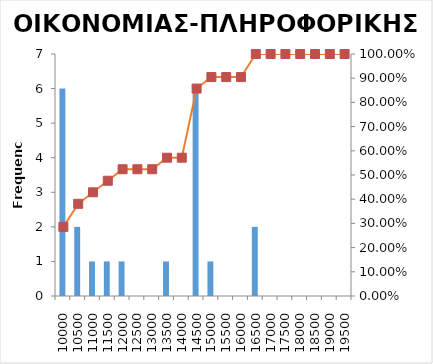
| Category | Series 0 |
|---|---|
| 10000 | 6 |
| 10500 | 2 |
| 11000 | 1 |
| 11500 | 1 |
| 12000 | 1 |
| 12500 | 0 |
| 13000 | 0 |
| 13500 | 1 |
| 14000 | 0 |
| 14500 | 6 |
| 15000 | 1 |
| 15500 | 0 |
| 16000 | 0 |
| 16500 | 2 |
| 17000 | 0 |
| 17500 | 0 |
| 18000 | 0 |
| 18500 | 0 |
| 19000 | 0 |
| 19500 | 0 |